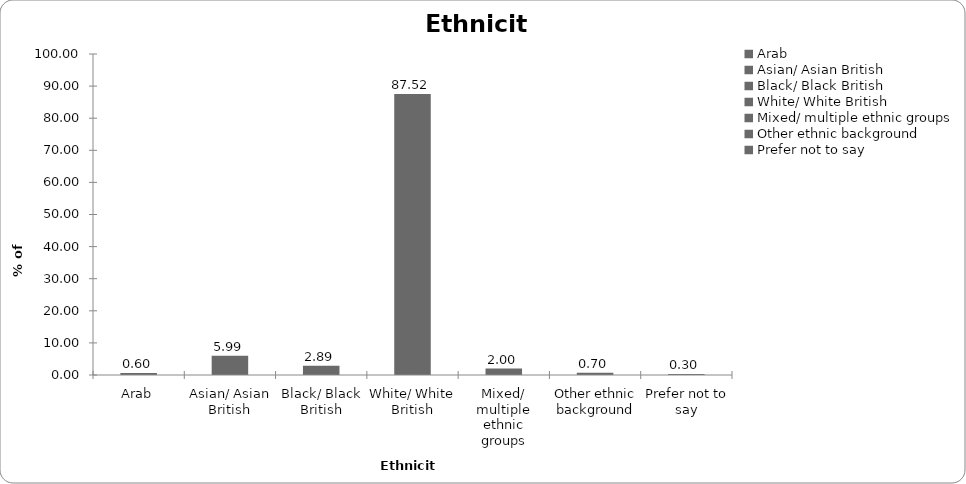
| Category | Ethnicity |
|---|---|
| Arab | 0.599 |
| Asian/ Asian British | 5.988 |
| Black/ Black British | 2.894 |
| White/ White British | 87.525 |
| Mixed/ multiple ethnic groups | 1.996 |
| Other ethnic background | 0.699 |
| Prefer not to say | 0.299 |